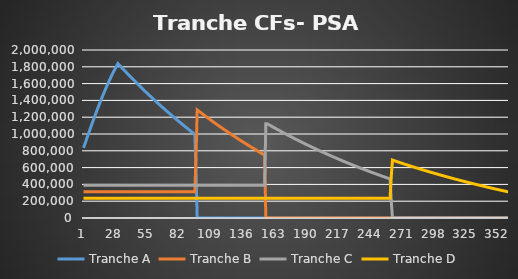
| Category | Tranche A | Tranche B | Tranche C | Tranche D |
|---|---|---|---|---|
| 0 | 834421.695 | 312500 | 390625 | 234375 |
| 1 | 875886.197 | 312500 | 390625 | 234375 |
| 2 | 917047.042 | 312500 | 390625 | 234375 |
| 3 | 957882.519 | 312500 | 390625 | 234375 |
| 4 | 998371.024 | 312500 | 390625 | 234375 |
| 5 | 1038491.08 | 312500 | 390625 | 234375 |
| 6 | 1078221.355 | 312500 | 390625 | 234375 |
| 7 | 1117540.679 | 312500 | 390625 | 234375 |
| 8 | 1156428.067 | 312500 | 390625 | 234375 |
| 9 | 1194862.734 | 312500 | 390625 | 234375 |
| 10 | 1232824.114 | 312500 | 390625 | 234375 |
| 11 | 1270291.879 | 312500 | 390625 | 234375 |
| 12 | 1307245.957 | 312500 | 390625 | 234375 |
| 13 | 1343666.552 | 312500 | 390625 | 234375 |
| 14 | 1379534.156 | 312500 | 390625 | 234375 |
| 15 | 1414829.573 | 312500 | 390625 | 234375 |
| 16 | 1449533.933 | 312500 | 390625 | 234375 |
| 17 | 1483628.712 | 312500 | 390625 | 234375 |
| 18 | 1517095.743 | 312500 | 390625 | 234375 |
| 19 | 1549917.239 | 312500 | 390625 | 234375 |
| 20 | 1582075.807 | 312500 | 390625 | 234375 |
| 21 | 1613554.462 | 312500 | 390625 | 234375 |
| 22 | 1644336.645 | 312500 | 390625 | 234375 |
| 23 | 1674406.237 | 312500 | 390625 | 234375 |
| 24 | 1703747.574 | 312500 | 390625 | 234375 |
| 25 | 1732345.461 | 312500 | 390625 | 234375 |
| 26 | 1760185.187 | 312500 | 390625 | 234375 |
| 27 | 1787252.536 | 312500 | 390625 | 234375 |
| 28 | 1813533.805 | 312500 | 390625 | 234375 |
| 29 | 1839015.808 | 312500 | 390625 | 234375 |
| 30 | 1823841.54 | 312500 | 390625 | 234375 |
| 31 | 1808743.98 | 312500 | 390625 | 234375 |
| 32 | 1793722.733 | 312500 | 390625 | 234375 |
| 33 | 1778777.405 | 312500 | 390625 | 234375 |
| 34 | 1763907.601 | 312500 | 390625 | 234375 |
| 35 | 1749112.933 | 312500 | 390625 | 234375 |
| 36 | 1734393.012 | 312500 | 390625 | 234375 |
| 37 | 1719747.451 | 312500 | 390625 | 234375 |
| 38 | 1705175.867 | 312500 | 390625 | 234375 |
| 39 | 1690677.875 | 312500 | 390625 | 234375 |
| 40 | 1676253.097 | 312500 | 390625 | 234375 |
| 41 | 1661901.153 | 312500 | 390625 | 234375 |
| 42 | 1647621.667 | 312500 | 390625 | 234375 |
| 43 | 1633414.264 | 312500 | 390625 | 234375 |
| 44 | 1619278.571 | 312500 | 390625 | 234375 |
| 45 | 1605214.219 | 312500 | 390625 | 234375 |
| 46 | 1591220.836 | 312500 | 390625 | 234375 |
| 47 | 1577298.058 | 312500 | 390625 | 234375 |
| 48 | 1563445.517 | 312500 | 390625 | 234375 |
| 49 | 1549662.853 | 312500 | 390625 | 234375 |
| 50 | 1535949.701 | 312500 | 390625 | 234375 |
| 51 | 1522305.705 | 312500 | 390625 | 234375 |
| 52 | 1508730.504 | 312500 | 390625 | 234375 |
| 53 | 1495223.745 | 312500 | 390625 | 234375 |
| 54 | 1481785.072 | 312500 | 390625 | 234375 |
| 55 | 1468414.133 | 312500 | 390625 | 234375 |
| 56 | 1455110.578 | 312500 | 390625 | 234375 |
| 57 | 1441874.059 | 312500 | 390625 | 234375 |
| 58 | 1428704.228 | 312500 | 390625 | 234375 |
| 59 | 1415600.741 | 312500 | 390625 | 234375 |
| 60 | 1402563.254 | 312500 | 390625 | 234375 |
| 61 | 1389591.426 | 312500 | 390625 | 234375 |
| 62 | 1376684.917 | 312500 | 390625 | 234375 |
| 63 | 1363843.388 | 312500 | 390625 | 234375 |
| 64 | 1351066.505 | 312500 | 390625 | 234375 |
| 65 | 1338353.931 | 312500 | 390625 | 234375 |
| 66 | 1325705.335 | 312500 | 390625 | 234375 |
| 67 | 1313120.385 | 312500 | 390625 | 234375 |
| 68 | 1300598.751 | 312500 | 390625 | 234375 |
| 69 | 1288140.107 | 312500 | 390625 | 234375 |
| 70 | 1275744.126 | 312500 | 390625 | 234375 |
| 71 | 1263410.483 | 312500 | 390625 | 234375 |
| 72 | 1251138.856 | 312500 | 390625 | 234375 |
| 73 | 1238928.923 | 312500 | 390625 | 234375 |
| 74 | 1226780.367 | 312500 | 390625 | 234375 |
| 75 | 1214692.867 | 312500 | 390625 | 234375 |
| 76 | 1202666.109 | 312500 | 390625 | 234375 |
| 77 | 1190699.779 | 312500 | 390625 | 234375 |
| 78 | 1178793.562 | 312500 | 390625 | 234375 |
| 79 | 1166947.148 | 312500 | 390625 | 234375 |
| 80 | 1155160.227 | 312500 | 390625 | 234375 |
| 81 | 1143432.491 | 312500 | 390625 | 234375 |
| 82 | 1131763.633 | 312500 | 390625 | 234375 |
| 83 | 1120153.349 | 312500 | 390625 | 234375 |
| 84 | 1108601.335 | 312500 | 390625 | 234375 |
| 85 | 1097107.289 | 312500 | 390625 | 234375 |
| 86 | 1085670.911 | 312500 | 390625 | 234375 |
| 87 | 1074291.903 | 312500 | 390625 | 234375 |
| 88 | 1062969.966 | 312500 | 390625 | 234375 |
| 89 | 1051704.806 | 312500 | 390625 | 234375 |
| 90 | 1040496.128 | 312500 | 390625 | 234375 |
| 91 | 1029343.639 | 312500 | 390625 | 234375 |
| 92 | 1018247.049 | 312500 | 390625 | 234375 |
| 93 | 1007206.067 | 312500 | 390625 | 234375 |
| 94 | 996220.406 | 312500 | 390625 | 234375 |
| 95 | 576194.913 | 721594.866 | 390625 | 234375 |
| 96 | 0 | 1286913.901 | 390625 | 234375 |
| 97 | 0 | 1276092.487 | 390625 | 234375 |
| 98 | 0 | 1265325.256 | 390625 | 234375 |
| 99 | 0 | 1254611.927 | 390625 | 234375 |
| 100 | 0 | 1243952.219 | 390625 | 234375 |
| 101 | 0 | 1233345.857 | 390625 | 234375 |
| 102 | 0 | 1222792.562 | 390625 | 234375 |
| 103 | 0 | 1212292.059 | 390625 | 234375 |
| 104 | 0 | 1201844.076 | 390625 | 234375 |
| 105 | 0 | 1191448.339 | 390625 | 234375 |
| 106 | 0 | 1181104.577 | 390625 | 234375 |
| 107 | 0 | 1170812.522 | 390625 | 234375 |
| 108 | 0 | 1160571.905 | 390625 | 234375 |
| 109 | 0 | 1150382.459 | 390625 | 234375 |
| 110 | 0 | 1140243.919 | 390625 | 234375 |
| 111 | 0 | 1130156.021 | 390625 | 234375 |
| 112 | 0 | 1120118.501 | 390625 | 234375 |
| 113 | 0 | 1110131.1 | 390625 | 234375 |
| 114 | 0 | 1100193.556 | 390625 | 234375 |
| 115 | 0 | 1090305.611 | 390625 | 234375 |
| 116 | 0 | 1080467.008 | 390625 | 234375 |
| 117 | 0 | 1070677.491 | 390625 | 234375 |
| 118 | 0 | 1060936.805 | 390625 | 234375 |
| 119 | 0 | 1051244.696 | 390625 | 234375 |
| 120 | 0 | 1041600.913 | 390625 | 234375 |
| 121 | 0 | 1032005.205 | 390625 | 234375 |
| 122 | 0 | 1022457.322 | 390625 | 234375 |
| 123 | 0 | 1012957.016 | 390625 | 234375 |
| 124 | 0 | 1003504.039 | 390625 | 234375 |
| 125 | 0 | 994098.148 | 390625 | 234375 |
| 126 | 0 | 984739.096 | 390625 | 234375 |
| 127 | 0 | 975426.64 | 390625 | 234375 |
| 128 | 0 | 966160.54 | 390625 | 234375 |
| 129 | 0 | 956940.553 | 390625 | 234375 |
| 130 | 0 | 947766.441 | 390625 | 234375 |
| 131 | 0 | 938637.966 | 390625 | 234375 |
| 132 | 0 | 929554.889 | 390625 | 234375 |
| 133 | 0 | 920516.977 | 390625 | 234375 |
| 134 | 0 | 911523.993 | 390625 | 234375 |
| 135 | 0 | 902575.705 | 390625 | 234375 |
| 136 | 0 | 893671.88 | 390625 | 234375 |
| 137 | 0 | 884812.288 | 390625 | 234375 |
| 138 | 0 | 875996.698 | 390625 | 234375 |
| 139 | 0 | 867224.882 | 390625 | 234375 |
| 140 | 0 | 858496.613 | 390625 | 234375 |
| 141 | 0 | 849811.664 | 390625 | 234375 |
| 142 | 0 | 841169.81 | 390625 | 234375 |
| 143 | 0 | 832570.827 | 390625 | 234375 |
| 144 | 0 | 824014.492 | 390625 | 234375 |
| 145 | 0 | 815500.584 | 390625 | 234375 |
| 146 | 0 | 807028.882 | 390625 | 234375 |
| 147 | 0 | 798599.166 | 390625 | 234375 |
| 148 | 0 | 790211.219 | 390625 | 234375 |
| 149 | 0 | 781864.823 | 390625 | 234375 |
| 150 | 0 | 773559.762 | 390625 | 234375 |
| 151 | 0 | 765295.821 | 390625 | 234375 |
| 152 | 0 | 757072.786 | 390625 | 234375 |
| 153 | 0 | 748890.445 | 390625 | 234375 |
| 154 | 0 | 9403.171 | 1121970.414 | 234375 |
| 155 | 0 | 0 | 1123271.998 | 234375 |
| 156 | 0 | 0 | 1115210.471 | 234375 |
| 157 | 0 | 0 | 1107188.798 | 234375 |
| 158 | 0 | 0 | 1099206.771 | 234375 |
| 159 | 0 | 0 | 1091264.183 | 234375 |
| 160 | 0 | 0 | 1083360.83 | 234375 |
| 161 | 0 | 0 | 1075496.508 | 234375 |
| 162 | 0 | 0 | 1067671.012 | 234375 |
| 163 | 0 | 0 | 1059884.141 | 234375 |
| 164 | 0 | 0 | 1052135.694 | 234375 |
| 165 | 0 | 0 | 1044425.471 | 234375 |
| 166 | 0 | 0 | 1036753.273 | 234375 |
| 167 | 0 | 0 | 1029118.902 | 234375 |
| 168 | 0 | 0 | 1021522.161 | 234375 |
| 169 | 0 | 0 | 1013962.853 | 234375 |
| 170 | 0 | 0 | 1006440.785 | 234375 |
| 171 | 0 | 0 | 998955.762 | 234375 |
| 172 | 0 | 0 | 991507.591 | 234375 |
| 173 | 0 | 0 | 984096.08 | 234375 |
| 174 | 0 | 0 | 976721.038 | 234375 |
| 175 | 0 | 0 | 969382.275 | 234375 |
| 176 | 0 | 0 | 962079.602 | 234375 |
| 177 | 0 | 0 | 954812.831 | 234375 |
| 178 | 0 | 0 | 947581.775 | 234375 |
| 179 | 0 | 0 | 940386.247 | 234375 |
| 180 | 0 | 0 | 933226.063 | 234375 |
| 181 | 0 | 0 | 926101.039 | 234375 |
| 182 | 0 | 0 | 919010.99 | 234375 |
| 183 | 0 | 0 | 911955.735 | 234375 |
| 184 | 0 | 0 | 904935.092 | 234375 |
| 185 | 0 | 0 | 897948.881 | 234375 |
| 186 | 0 | 0 | 890996.921 | 234375 |
| 187 | 0 | 0 | 884079.035 | 234375 |
| 188 | 0 | 0 | 877195.045 | 234375 |
| 189 | 0 | 0 | 870344.774 | 234375 |
| 190 | 0 | 0 | 863528.045 | 234375 |
| 191 | 0 | 0 | 856744.685 | 234375 |
| 192 | 0 | 0 | 849994.518 | 234375 |
| 193 | 0 | 0 | 843277.372 | 234375 |
| 194 | 0 | 0 | 836593.074 | 234375 |
| 195 | 0 | 0 | 829941.452 | 234375 |
| 196 | 0 | 0 | 823322.337 | 234375 |
| 197 | 0 | 0 | 816735.558 | 234375 |
| 198 | 0 | 0 | 810180.947 | 234375 |
| 199 | 0 | 0 | 803658.335 | 234375 |
| 200 | 0 | 0 | 797167.555 | 234375 |
| 201 | 0 | 0 | 790708.442 | 234375 |
| 202 | 0 | 0 | 784280.83 | 234375 |
| 203 | 0 | 0 | 777884.553 | 234375 |
| 204 | 0 | 0 | 771519.449 | 234375 |
| 205 | 0 | 0 | 765185.355 | 234375 |
| 206 | 0 | 0 | 758882.108 | 234375 |
| 207 | 0 | 0 | 752609.548 | 234375 |
| 208 | 0 | 0 | 746367.514 | 234375 |
| 209 | 0 | 0 | 740155.845 | 234375 |
| 210 | 0 | 0 | 733974.385 | 234375 |
| 211 | 0 | 0 | 727822.974 | 234375 |
| 212 | 0 | 0 | 721701.455 | 234375 |
| 213 | 0 | 0 | 715609.673 | 234375 |
| 214 | 0 | 0 | 709547.471 | 234375 |
| 215 | 0 | 0 | 703514.695 | 234375 |
| 216 | 0 | 0 | 697511.191 | 234375 |
| 217 | 0 | 0 | 691536.805 | 234375 |
| 218 | 0 | 0 | 685591.387 | 234375 |
| 219 | 0 | 0 | 679674.782 | 234375 |
| 220 | 0 | 0 | 673786.842 | 234375 |
| 221 | 0 | 0 | 667927.416 | 234375 |
| 222 | 0 | 0 | 662096.354 | 234375 |
| 223 | 0 | 0 | 656293.509 | 234375 |
| 224 | 0 | 0 | 650518.732 | 234375 |
| 225 | 0 | 0 | 644771.876 | 234375 |
| 226 | 0 | 0 | 639052.795 | 234375 |
| 227 | 0 | 0 | 633361.344 | 234375 |
| 228 | 0 | 0 | 627697.378 | 234375 |
| 229 | 0 | 0 | 622060.753 | 234375 |
| 230 | 0 | 0 | 616451.325 | 234375 |
| 231 | 0 | 0 | 610868.952 | 234375 |
| 232 | 0 | 0 | 605313.493 | 234375 |
| 233 | 0 | 0 | 599784.805 | 234375 |
| 234 | 0 | 0 | 594282.75 | 234375 |
| 235 | 0 | 0 | 588807.186 | 234375 |
| 236 | 0 | 0 | 583357.976 | 234375 |
| 237 | 0 | 0 | 577934.98 | 234375 |
| 238 | 0 | 0 | 572538.062 | 234375 |
| 239 | 0 | 0 | 567167.084 | 234375 |
| 240 | 0 | 0 | 561821.911 | 234375 |
| 241 | 0 | 0 | 556502.407 | 234375 |
| 242 | 0 | 0 | 551208.438 | 234375 |
| 243 | 0 | 0 | 545939.868 | 234375 |
| 244 | 0 | 0 | 540696.566 | 234375 |
| 245 | 0 | 0 | 535478.397 | 234375 |
| 246 | 0 | 0 | 530285.231 | 234375 |
| 247 | 0 | 0 | 525116.936 | 234375 |
| 248 | 0 | 0 | 519973.382 | 234375 |
| 249 | 0 | 0 | 514854.437 | 234375 |
| 250 | 0 | 0 | 509759.974 | 234375 |
| 251 | 0 | 0 | 504689.862 | 234375 |
| 252 | 0 | 0 | 499643.976 | 234375 |
| 253 | 0 | 0 | 494622.186 | 234375 |
| 254 | 0 | 0 | 489624.366 | 234375 |
| 255 | 0 | 0 | 484650.391 | 234375 |
| 256 | 0 | 0 | 479700.135 | 234375 |
| 257 | 0 | 0 | 474773.473 | 234375 |
| 258 | 0 | 0 | 469870.28 | 234375 |
| 259 | 0 | 0 | 464990.434 | 234375 |
| 260 | 0 | 0 | 198980.667 | 495528.145 |
| 261 | 0 | 0 | 0 | 689675.291 |
| 262 | 0 | 0 | 0 | 684864.75 |
| 263 | 0 | 0 | 0 | 680077.068 |
| 264 | 0 | 0 | 0 | 675312.125 |
| 265 | 0 | 0 | 0 | 670569.8 |
| 266 | 0 | 0 | 0 | 665849.974 |
| 267 | 0 | 0 | 0 | 661152.53 |
| 268 | 0 | 0 | 0 | 656477.348 |
| 269 | 0 | 0 | 0 | 651824.313 |
| 270 | 0 | 0 | 0 | 647193.306 |
| 271 | 0 | 0 | 0 | 642584.213 |
| 272 | 0 | 0 | 0 | 637996.916 |
| 273 | 0 | 0 | 0 | 633431.303 |
| 274 | 0 | 0 | 0 | 628887.257 |
| 275 | 0 | 0 | 0 | 624364.665 |
| 276 | 0 | 0 | 0 | 619863.415 |
| 277 | 0 | 0 | 0 | 615383.393 |
| 278 | 0 | 0 | 0 | 610924.488 |
| 279 | 0 | 0 | 0 | 606486.588 |
| 280 | 0 | 0 | 0 | 602069.582 |
| 281 | 0 | 0 | 0 | 597673.359 |
| 282 | 0 | 0 | 0 | 593297.811 |
| 283 | 0 | 0 | 0 | 588942.827 |
| 284 | 0 | 0 | 0 | 584608.3 |
| 285 | 0 | 0 | 0 | 580294.12 |
| 286 | 0 | 0 | 0 | 576000.181 |
| 287 | 0 | 0 | 0 | 571726.376 |
| 288 | 0 | 0 | 0 | 567472.597 |
| 289 | 0 | 0 | 0 | 563238.74 |
| 290 | 0 | 0 | 0 | 559024.698 |
| 291 | 0 | 0 | 0 | 554830.367 |
| 292 | 0 | 0 | 0 | 550655.643 |
| 293 | 0 | 0 | 0 | 546500.422 |
| 294 | 0 | 0 | 0 | 542364.601 |
| 295 | 0 | 0 | 0 | 538248.076 |
| 296 | 0 | 0 | 0 | 534150.746 |
| 297 | 0 | 0 | 0 | 530072.509 |
| 298 | 0 | 0 | 0 | 526013.265 |
| 299 | 0 | 0 | 0 | 521972.911 |
| 300 | 0 | 0 | 0 | 517951.349 |
| 301 | 0 | 0 | 0 | 513948.478 |
| 302 | 0 | 0 | 0 | 509964.2 |
| 303 | 0 | 0 | 0 | 505998.415 |
| 304 | 0 | 0 | 0 | 502051.027 |
| 305 | 0 | 0 | 0 | 498121.937 |
| 306 | 0 | 0 | 0 | 494211.047 |
| 307 | 0 | 0 | 0 | 490318.263 |
| 308 | 0 | 0 | 0 | 486443.487 |
| 309 | 0 | 0 | 0 | 482586.623 |
| 310 | 0 | 0 | 0 | 478747.578 |
| 311 | 0 | 0 | 0 | 474926.255 |
| 312 | 0 | 0 | 0 | 471122.561 |
| 313 | 0 | 0 | 0 | 467336.403 |
| 314 | 0 | 0 | 0 | 463567.686 |
| 315 | 0 | 0 | 0 | 459816.319 |
| 316 | 0 | 0 | 0 | 456082.208 |
| 317 | 0 | 0 | 0 | 452365.263 |
| 318 | 0 | 0 | 0 | 448665.392 |
| 319 | 0 | 0 | 0 | 444982.504 |
| 320 | 0 | 0 | 0 | 441316.509 |
| 321 | 0 | 0 | 0 | 437667.316 |
| 322 | 0 | 0 | 0 | 434034.837 |
| 323 | 0 | 0 | 0 | 430418.982 |
| 324 | 0 | 0 | 0 | 426819.662 |
| 325 | 0 | 0 | 0 | 423236.79 |
| 326 | 0 | 0 | 0 | 419670.278 |
| 327 | 0 | 0 | 0 | 416120.039 |
| 328 | 0 | 0 | 0 | 412585.986 |
| 329 | 0 | 0 | 0 | 409068.032 |
| 330 | 0 | 0 | 0 | 405566.092 |
| 331 | 0 | 0 | 0 | 402080.08 |
| 332 | 0 | 0 | 0 | 398609.912 |
| 333 | 0 | 0 | 0 | 395155.502 |
| 334 | 0 | 0 | 0 | 391716.766 |
| 335 | 0 | 0 | 0 | 388293.621 |
| 336 | 0 | 0 | 0 | 384885.984 |
| 337 | 0 | 0 | 0 | 381493.771 |
| 338 | 0 | 0 | 0 | 378116.901 |
| 339 | 0 | 0 | 0 | 374755.29 |
| 340 | 0 | 0 | 0 | 371408.858 |
| 341 | 0 | 0 | 0 | 368077.523 |
| 342 | 0 | 0 | 0 | 364761.205 |
| 343 | 0 | 0 | 0 | 361459.823 |
| 344 | 0 | 0 | 0 | 358173.296 |
| 345 | 0 | 0 | 0 | 354901.547 |
| 346 | 0 | 0 | 0 | 351644.494 |
| 347 | 0 | 0 | 0 | 348402.06 |
| 348 | 0 | 0 | 0 | 345174.167 |
| 349 | 0 | 0 | 0 | 341960.736 |
| 350 | 0 | 0 | 0 | 338761.689 |
| 351 | 0 | 0 | 0 | 335576.95 |
| 352 | 0 | 0 | 0 | 332406.442 |
| 353 | 0 | 0 | 0 | 329250.088 |
| 354 | 0 | 0 | 0 | 326107.813 |
| 355 | 0 | 0 | 0 | 322979.54 |
| 356 | 0 | 0 | 0 | 319865.195 |
| 357 | 0 | 0 | 0 | 316764.702 |
| 358 | 0 | 0 | 0 | 313677.988 |
| 359 | 0 | 0 | 0 | 310604.978 |